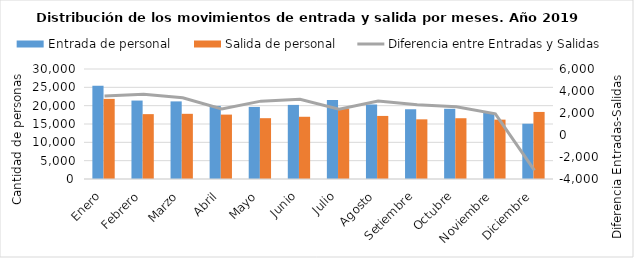
| Category | Entrada de personal  | Salida de personal |
|---|---|---|
| Enero | 25405 | 21855 |
| Febrero | 21394 | 17690 |
| Marzo | 21165 | 17778 |
| Abril | 19932 | 17563 |
| Mayo | 19663 | 16586 |
| Junio | 20211 | 16972 |
| Julio | 21567 | 19233 |
| Agosto | 20287 | 17199 |
| Setiembre | 19022 | 16270 |
| Octubre | 19146 | 16573 |
| Noviembre | 18113 | 16192 |
| Diciembre | 15077 | 18289 |